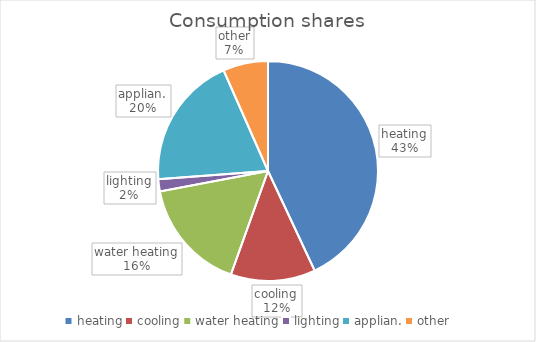
| Category | Series 0 |
|---|---|
| heating | 2941805.211 |
| cooling | 851760 |
| water heating | 1131463.543 |
| lighting | 121680 |
| applian. | 1338480 |
| other | 452585.417 |